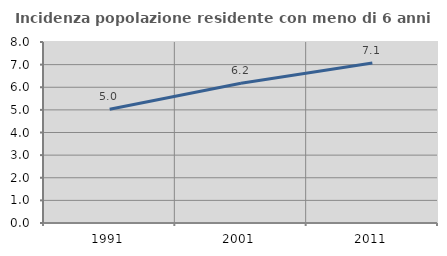
| Category | Incidenza popolazione residente con meno di 6 anni |
|---|---|
| 1991.0 | 5.026 |
| 2001.0 | 6.179 |
| 2011.0 | 7.069 |